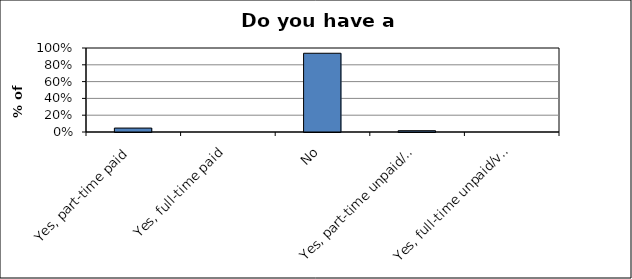
| Category | Series 0 |
|---|---|
| Yes, part-time paid | 0.047 |
| Yes, full-time paid | 0 |
| No | 0.938 |
| Yes, part-time unpaid/volunteer | 0.016 |
| Yes, full-time unpaid/volunteer | 0 |